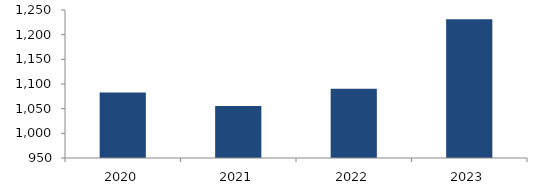
| Category | Bogotá |
|---|---|
| 2020.0 | 1082.539 |
| 2021.0 | 1055.57 |
| 2022.0 | 1090.459 |
| 2023.0 | 1231.097 |